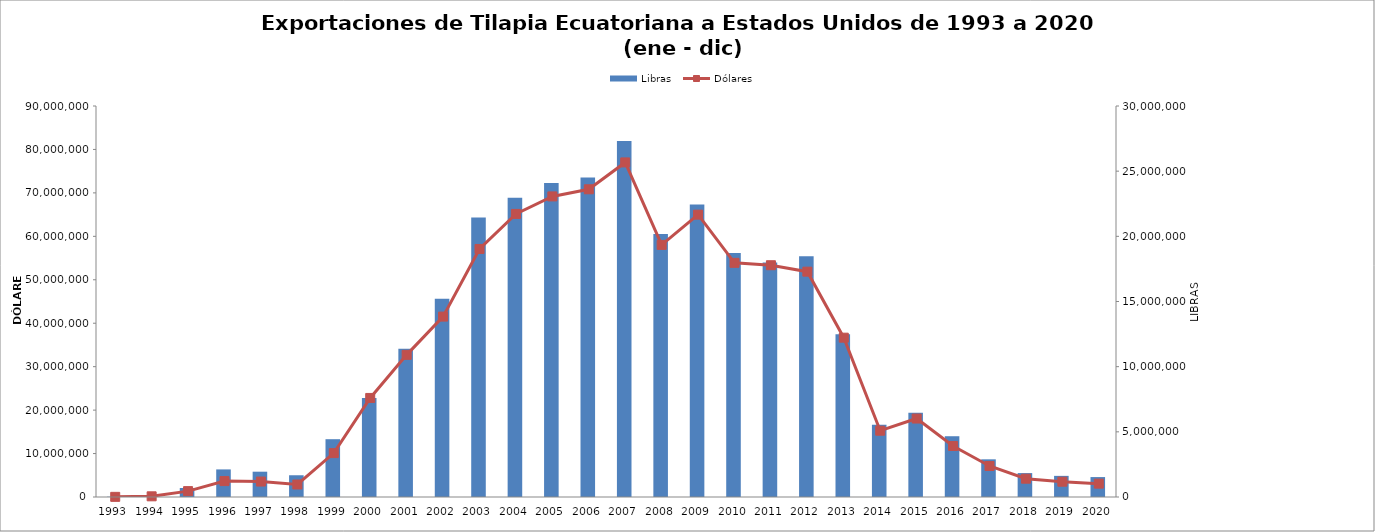
| Category | Libras |
|---|---|
| 1993.0 | 21730.742 |
| 1994.0 | 88499.258 |
| 1995.0 | 689457.786 |
| 1996.0 | 2116647.483 |
| 1997.0 | 1941708.064 |
| 1998.0 | 1668547.101 |
| 1999.0 | 4434656.516 |
| 2000.0 | 7599686.097 |
| 2001.0 | 11373890.75 |
| 2002.0 | 15219326.029 |
| 2003.0 | 21443302.043 |
| 2004.0 | 22953708.776 |
| 2005.0 | 24101028.913 |
| 2006.0 | 24512713.712 |
| 2007.0 | 27315395.237 |
| 2008.0 | 20170218.295 |
| 2009.0 | 22438586.35 |
| 2010.0 | 18724421.773 |
| 2011.0 | 17995543.535 |
| 2012.0 | 18477544.051 |
| 2013.0 | 12494087.693 |
| 2014.0 | 5552509.969 |
| 2015.0 | 6465454.516 |
| 2016.0 | 4663040.341 |
| 2017.0 | 2890376.104 |
| 2018.0 | 1835184.029 |
| 2019.0 | 1621389.754 |
| 2020.0 | 1529363.158 |